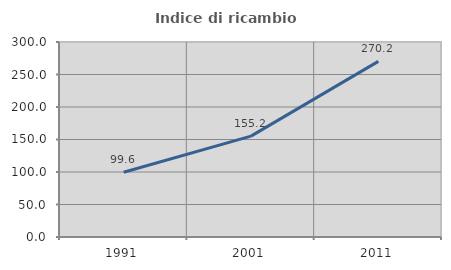
| Category | Indice di ricambio occupazionale  |
|---|---|
| 1991.0 | 99.558 |
| 2001.0 | 155.193 |
| 2011.0 | 270.164 |